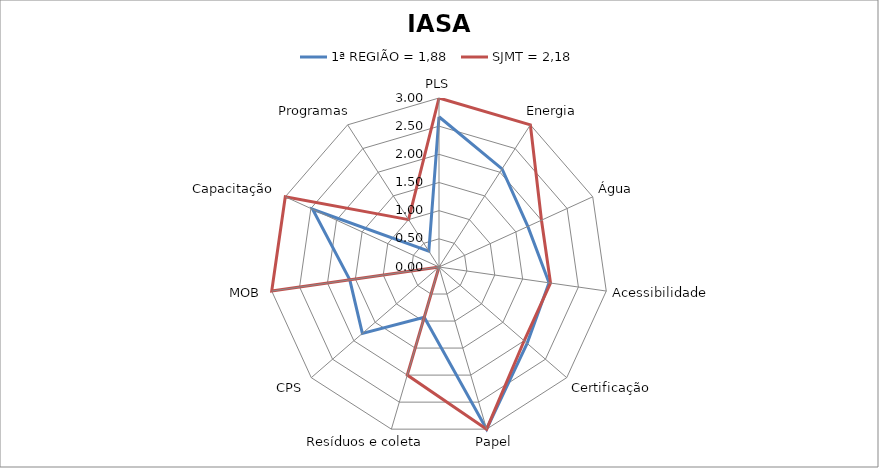
| Category | 1ª REGIÃO = 1,88 | SJMT = 2,18 |
|---|---|---|
| PLS | 2.667 | 3 |
| Energia | 2.07 | 3 |
| Água | 1.733 | 2 |
| Acessibilidade | 1.973 | 2 |
| Certificação | 2.07 | 2 |
| Papel | 3 | 3 |
| Resíduos e coleta | 0.93 | 2 |
| CPS | 1.8 | 0 |
| MOB | 1.6 | 3 |
| Capacitação | 2.467 | 3 |
| Programas | 0.333 | 1 |